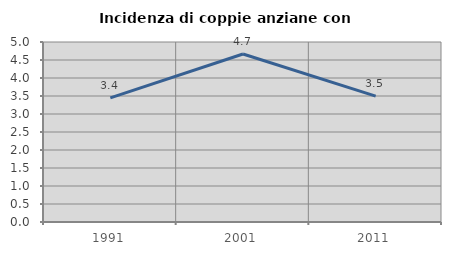
| Category | Incidenza di coppie anziane con figli |
|---|---|
| 1991.0 | 3.448 |
| 2001.0 | 4.667 |
| 2011.0 | 3.497 |